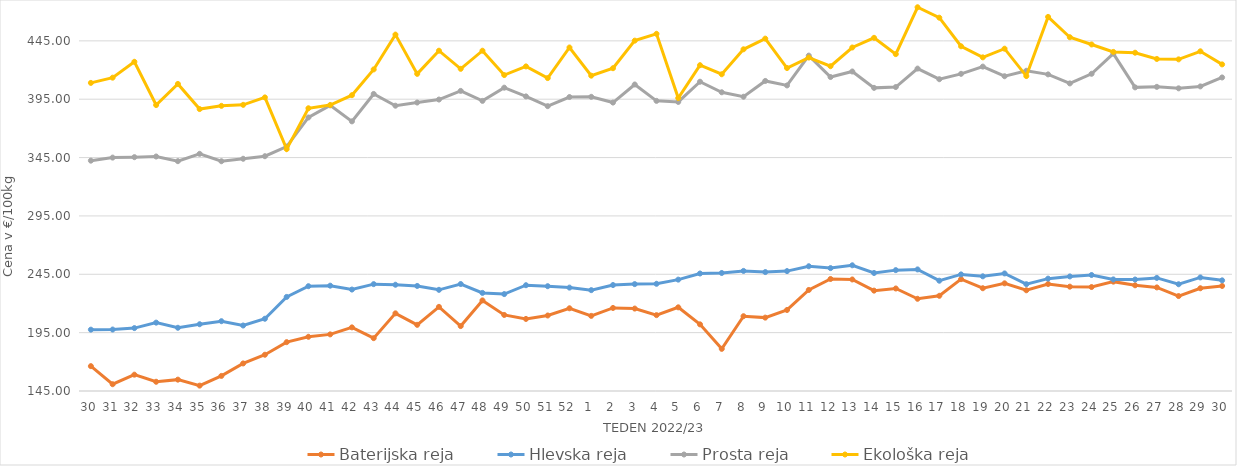
| Category | Baterijska reja | Hlevska reja | Prosta reja | Ekološka reja |
|---|---|---|---|---|
| 30.0 | 166.29 | 197.55 | 342.35 | 408.97 |
| 31.0 | 150.81 | 197.66 | 344.97 | 413.45 |
| 32.0 | 158.99 | 198.9 | 345.35 | 427.07 |
| 33.0 | 152.91 | 203.57 | 345.9 | 390 |
| 34.0 | 154.73 | 199.17 | 341.92 | 408.1 |
| 35.0 | 149.6 | 202.21 | 348.2 | 386.55 |
| 36.0 | 157.93 | 204.81 | 341.85 | 389.31 |
| 37.0 | 168.61 | 201.11 | 343.97 | 390.17 |
| 38.0 | 176.07 | 206.91 | 346.16 | 396.55 |
| 39.0 | 186.86 | 225.6 | 354.41 | 352.24 |
| 40.0 | 191.45 | 234.79 | 379.35 | 387.24 |
| 41.0 | 193.52 | 235.24 | 389.75 | 390 |
| 42.0 | 199.51 | 231.92 | 376.02 | 398.45 |
| 43.0 | 190.28 | 236.56 | 399.51 | 420.52 |
| 44.0 | 211.53 | 236.04 | 389.44 | 450.35 |
| 45.0 | 201.69 | 235.01 | 392.15 | 416.72 |
| 46.0 | 217.08 | 231.68 | 394.71 | 436.55 |
| 47.0 | 200.62 | 236.65 | 402.12 | 421.03 |
| 48.0 | 222.61 | 229.05 | 393.56 | 436.55 |
| 49.0 | 210.16 | 228.03 | 404.87 | 415.69 |
| 50.0 | 206.76 | 235.63 | 397.4 | 423.1 |
| 51.0 | 209.69 | 234.79 | 389.05 | 413.1 |
| 52.0 | 215.87 | 233.58 | 396.87 | 439.31 |
| 1.0 | 209.37 | 231.41 | 397.04 | 415.17 |
| 2.0 | 216.15 | 235.78 | 392.13 | 421.55 |
| 3.0 | 215.63 | 236.58 | 407.61 | 445.17 |
| 4.0 | 210 | 236.85 | 393.58 | 451.04 |
| 5.0 | 216.7 | 240.42 | 392.67 | 396.03 |
| 6.0 | 202.1 | 245.67 | 409.97 | 424.14 |
| 7.0 | 181.11 | 246.12 | 400.94 | 416.38 |
| 8.0 | 209.08 | 247.88 | 397.11 | 437.76 |
| 9.0 | 207.87 | 246.89 | 410.64 | 446.9 |
| 10.0 | 214.42 | 247.73 | 406.8 | 421.72 |
| 11.0 | 231.56 | 251.88 | 432.34 | 430.69 |
| 12.0 | 240.97 | 250.3 | 414 | 423.28 |
| 13.0 | 240.55 | 252.7 | 418.74 | 439.31 |
| 14.0 | 230.99 | 246.12 | 404.72 | 447.59 |
| 15.0 | 232.82 | 248.56 | 405.42 | 433.62 |
| 16.0 | 224 | 249.17 | 421.22 | 473.79 |
| 17.0 | 226.57 | 239.5 | 412.13 | 464.83 |
| 18.0 | 240.83 | 244.89 | 416.74 | 440.35 |
| 19.0 | 233.05 | 243.26 | 422.93 | 430.86 |
| 20.0 | 237.25 | 245.73 | 414.68 | 438.28 |
| 21.0 | 231.3 | 236.5 | 419.36 | 414.83 |
| 22.0 | 236.67 | 241.27 | 416.27 | 465.52 |
| 23.0 | 234.39 | 243.16 | 408.53 | 448.1 |
| 24.0 | 234.08 | 244.37 | 416.78 | 441.9 |
| 25.0 | 238.69 | 240.6 | 434.05 | 435.52 |
| 26.0 | 235.57 | 240.51 | 405.15 | 434.83 |
| 27.0 | 233.75 | 241.89 | 405.58 | 429.48 |
| 28.0 | 226.35 | 236.46 | 404.32 | 429.14 |
| 29.0 | 233.03 | 242.31 | 405.96 | 436.04 |
| 30.0 | 235 | 239.8 | 413.63 | 424.83 |